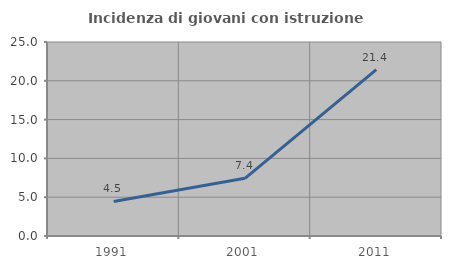
| Category | Incidenza di giovani con istruzione universitaria |
|---|---|
| 1991.0 | 4.459 |
| 2001.0 | 7.432 |
| 2011.0 | 21.429 |